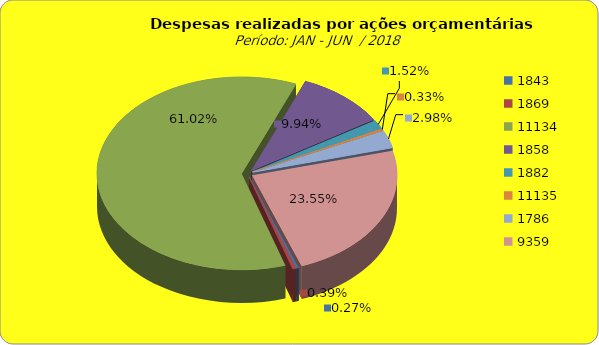
| Category | Series 1 |
|---|---|
| 1843.0 | 377866.03 |
| 1869.0 | 538499.26 |
| 11134.0 | 84329684.94 |
| 1858.0 | 13740791.03 |
| 1882.0 | 2095599.67 |
| 11135.0 | 449831.59 |
| 1786.0 | 4121907.51 |
| 9359.0 | 32542077.09 |